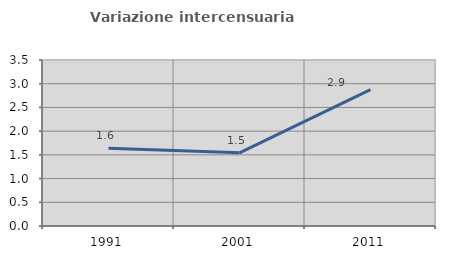
| Category | Variazione intercensuaria annua |
|---|---|
| 1991.0 | 1.642 |
| 2001.0 | 1.543 |
| 2011.0 | 2.875 |